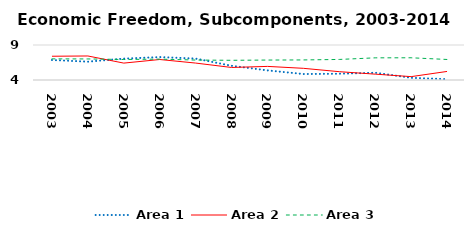
| Category | Area 1 | Area 2 | Area 3 |
|---|---|---|---|
| 2003.0 | 6.854 | 7.394 | 7.019 |
| 2004.0 | 6.621 | 7.432 | 7.008 |
| 2005.0 | 7.051 | 6.415 | 6.93 |
| 2006.0 | 7.278 | 6.928 | 6.983 |
| 2007.0 | 7.059 | 6.418 | 6.85 |
| 2008.0 | 6.03 | 5.788 | 6.814 |
| 2009.0 | 5.374 | 5.944 | 6.85 |
| 2010.0 | 4.854 | 5.668 | 6.867 |
| 2011.0 | 4.893 | 5.188 | 6.936 |
| 2012.0 | 5.038 | 4.837 | 7.167 |
| 2013.0 | 4.312 | 4.481 | 7.174 |
| 2014.0 | 4.116 | 5.223 | 6.932 |